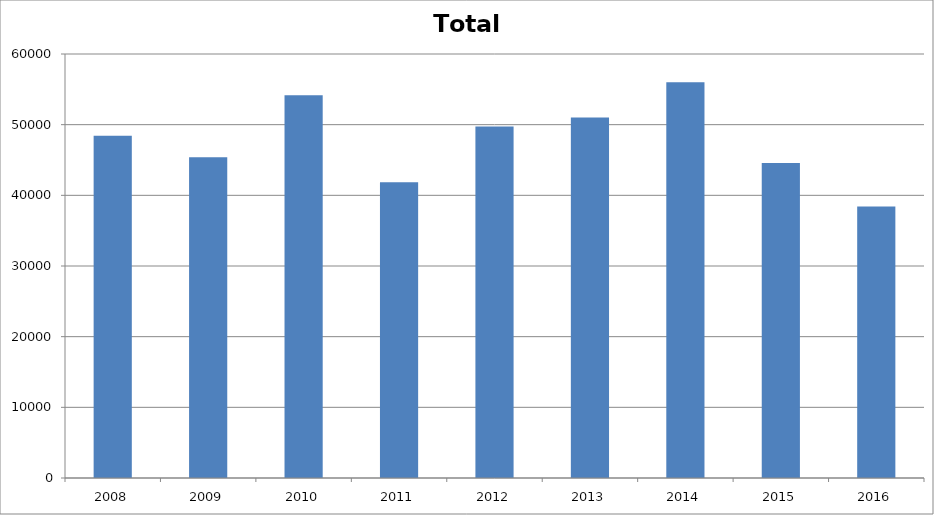
| Category | Total |
|---|---|
| 2008.0 | 48438 |
| 2009.0 | 45394 |
| 2010.0 | 54146 |
| 2011.0 | 41841 |
| 2012.0 | 49755 |
| 2013.0 | 51008 |
| 2014.0 | 56010 |
| 2015.0 | 44561.8 |
| 2016.0 | 38413 |